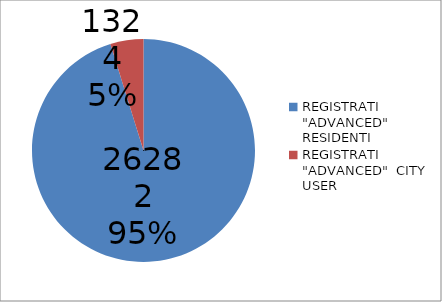
| Category | Series 0 |
|---|---|
| REGISTRATI "ADVANCED" RESIDENTI | 26282 |
| REGISTRATI "ADVANCED"  CITY USER | 1324 |